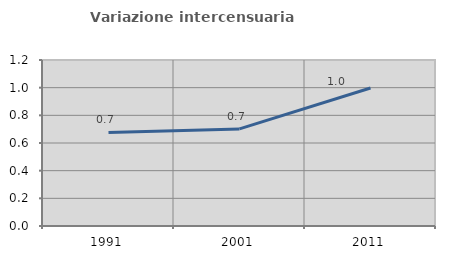
| Category | Variazione intercensuaria annua |
|---|---|
| 1991.0 | 0.676 |
| 2001.0 | 0.702 |
| 2011.0 | 0.998 |